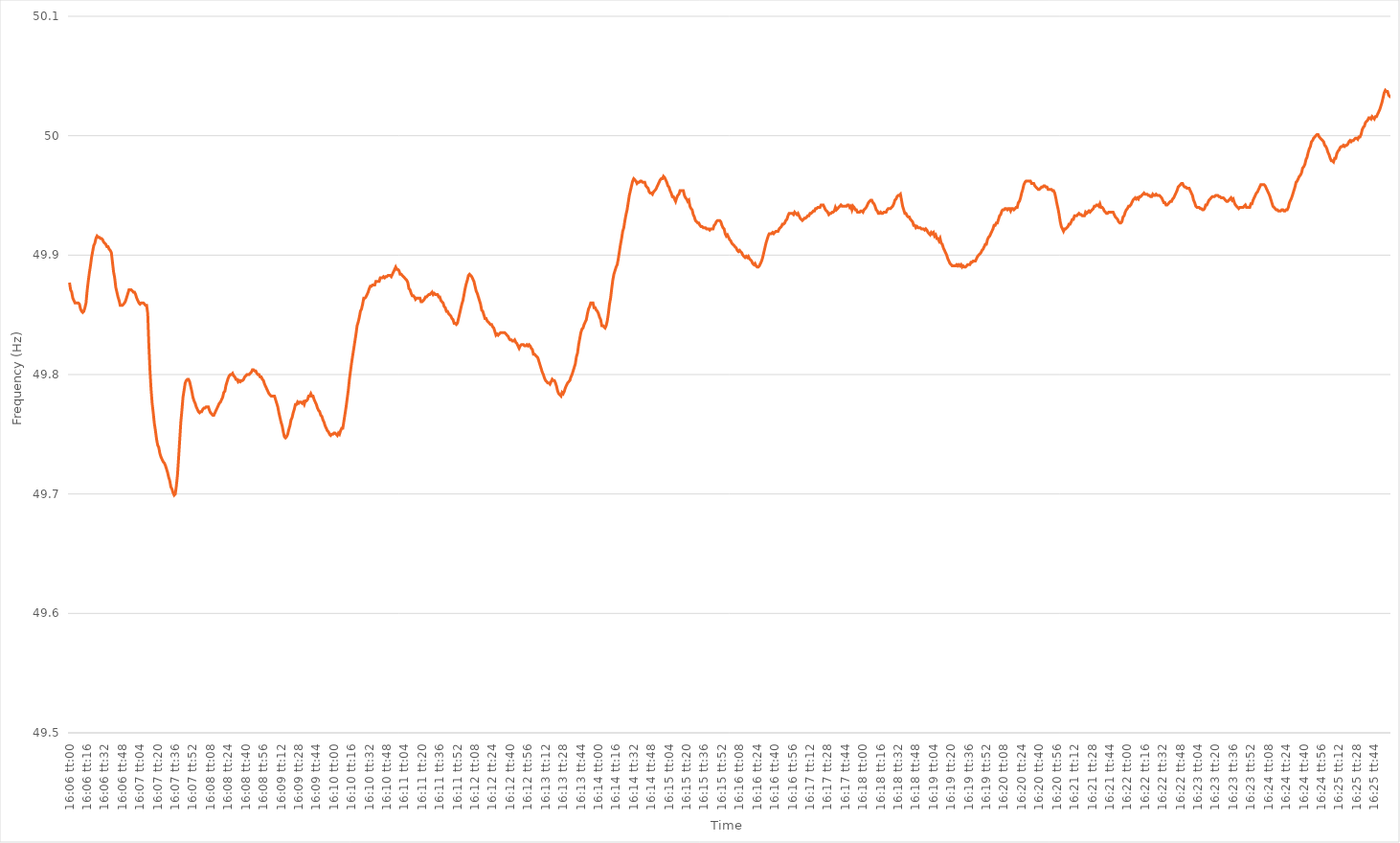
| Category | Series 0 |
|---|---|
| 0.6708333333333334 | 49.877 |
| 0.6708449074074073 | 49.871 |
| 0.6708564814814815 | 49.869 |
| 0.6708680555555556 | 49.864 |
| 0.6708796296296297 | 49.862 |
| 0.6708912037037037 | 49.86 |
| 0.6709027777777777 | 49.86 |
| 0.6709143518518519 | 49.86 |
| 0.670925925925926 | 49.86 |
| 0.6709375 | 49.859 |
| 0.6709490740740741 | 49.855 |
| 0.6709606481481482 | 49.853 |
| 0.6709722222222222 | 49.852 |
| 0.6709837962962962 | 49.853 |
| 0.6709953703703704 | 49.856 |
| 0.6710069444444445 | 49.86 |
| 0.6710185185185185 | 49.87 |
| 0.6710300925925926 | 49.878 |
| 0.6710416666666666 | 49.885 |
| 0.6710532407407408 | 49.891 |
| 0.6710648148148147 | 49.898 |
| 0.6710763888888889 | 49.903 |
| 0.671087962962963 | 49.908 |
| 0.6710995370370371 | 49.91 |
| 0.6711111111111111 | 49.914 |
| 0.6711226851851851 | 49.916 |
| 0.6711342592592593 | 49.915 |
| 0.6711458333333334 | 49.915 |
| 0.6711574074074074 | 49.914 |
| 0.6711689814814815 | 49.914 |
| 0.6711805555555556 | 49.913 |
| 0.6711921296296296 | 49.911 |
| 0.6712037037037036 | 49.91 |
| 0.6712152777777778 | 49.909 |
| 0.6712268518518519 | 49.907 |
| 0.6712384259259259 | 49.907 |
| 0.67125 | 49.905 |
| 0.671261574074074 | 49.904 |
| 0.6712731481481482 | 49.902 |
| 0.6712847222222221 | 49.894 |
| 0.6712962962962963 | 49.886 |
| 0.6713078703703704 | 49.881 |
| 0.6713194444444445 | 49.873 |
| 0.6713310185185185 | 49.869 |
| 0.6713425925925925 | 49.865 |
| 0.6713541666666667 | 49.862 |
| 0.6713657407407408 | 49.858 |
| 0.6713773148148148 | 49.858 |
| 0.6713888888888889 | 49.858 |
| 0.671400462962963 | 49.859 |
| 0.671412037037037 | 49.86 |
| 0.671423611111111 | 49.862 |
| 0.6714351851851852 | 49.865 |
| 0.6714467592592593 | 49.868 |
| 0.6714583333333333 | 49.871 |
| 0.6714699074074074 | 49.871 |
| 0.6714814814814815 | 49.871 |
| 0.6714930555555556 | 49.87 |
| 0.6715046296296295 | 49.869 |
| 0.6715162037037037 | 49.869 |
| 0.6715277777777778 | 49.867 |
| 0.6715393518518519 | 49.864 |
| 0.6715509259259259 | 49.862 |
| 0.6715625 | 49.86 |
| 0.6715740740740741 | 49.859 |
| 0.6715856481481483 | 49.86 |
| 0.6715972222222222 | 49.86 |
| 0.6716087962962963 | 49.86 |
| 0.6716203703703704 | 49.859 |
| 0.6716319444444445 | 49.858 |
| 0.6716435185185184 | 49.858 |
| 0.6716550925925926 | 49.851 |
| 0.6716666666666667 | 49.825 |
| 0.6716782407407407 | 49.804 |
| 0.6716898148148148 | 49.788 |
| 0.6717013888888889 | 49.776 |
| 0.671712962962963 | 49.768 |
| 0.6717245370370369 | 49.759 |
| 0.6717361111111111 | 49.753 |
| 0.6717476851851852 | 49.746 |
| 0.6717592592592593 | 49.741 |
| 0.6717708333333333 | 49.739 |
| 0.6717824074074074 | 49.734 |
| 0.6717939814814815 | 49.731 |
| 0.6718055555555557 | 49.729 |
| 0.6718171296296296 | 49.727 |
| 0.6718287037037037 | 49.726 |
| 0.6718402777777778 | 49.724 |
| 0.6718518518518519 | 49.721 |
| 0.6718634259259259 | 49.718 |
| 0.671875 | 49.714 |
| 0.6718865740740741 | 49.711 |
| 0.6718981481481481 | 49.706 |
| 0.6719097222222222 | 49.704 |
| 0.6719212962962963 | 49.701 |
| 0.6719328703703704 | 49.699 |
| 0.6719444444444443 | 49.7 |
| 0.6719560185185185 | 49.707 |
| 0.6719675925925926 | 49.716 |
| 0.6719791666666667 | 49.73 |
| 0.6719907407407407 | 49.745 |
| 0.6720023148148148 | 49.76 |
| 0.6720138888888889 | 49.77 |
| 0.6720254629629631 | 49.781 |
| 0.672037037037037 | 49.787 |
| 0.6720486111111111 | 49.793 |
| 0.6720601851851852 | 49.795 |
| 0.6720717592592593 | 49.796 |
| 0.6720833333333333 | 49.796 |
| 0.6720949074074074 | 49.794 |
| 0.6721064814814816 | 49.79 |
| 0.6721180555555555 | 49.786 |
| 0.6721296296296296 | 49.781 |
| 0.6721412037037037 | 49.778 |
| 0.6721527777777778 | 49.776 |
| 0.6721643518518517 | 49.773 |
| 0.6721759259259259 | 49.771 |
| 0.6721875 | 49.769 |
| 0.6721990740740741 | 49.768 |
| 0.6722106481481481 | 49.769 |
| 0.6722222222222222 | 49.769 |
| 0.6722337962962963 | 49.771 |
| 0.6722453703703705 | 49.772 |
| 0.6722569444444444 | 49.772 |
| 0.6722685185185185 | 49.773 |
| 0.6722800925925926 | 49.773 |
| 0.6722916666666667 | 49.773 |
| 0.6723032407407407 | 49.77 |
| 0.6723148148148148 | 49.768 |
| 0.672326388888889 | 49.767 |
| 0.672337962962963 | 49.766 |
| 0.672349537037037 | 49.766 |
| 0.6723611111111111 | 49.768 |
| 0.6723726851851852 | 49.77 |
| 0.6723842592592592 | 49.772 |
| 0.6723958333333333 | 49.774 |
| 0.6724074074074075 | 49.776 |
| 0.6724189814814815 | 49.777 |
| 0.6724305555555555 | 49.779 |
| 0.6724421296296296 | 49.781 |
| 0.6724537037037037 | 49.785 |
| 0.6724652777777779 | 49.786 |
| 0.6724768518518518 | 49.791 |
| 0.672488425925926 | 49.794 |
| 0.6725 | 49.797 |
| 0.6725115740740741 | 49.799 |
| 0.6725231481481481 | 49.8 |
| 0.6725347222222222 | 49.8 |
| 0.6725462962962964 | 49.801 |
| 0.6725578703703704 | 49.799 |
| 0.6725694444444444 | 49.798 |
| 0.6725810185185185 | 49.796 |
| 0.6725925925925926 | 49.796 |
| 0.6726041666666666 | 49.794 |
| 0.6726157407407407 | 49.795 |
| 0.6726273148148149 | 49.794 |
| 0.6726388888888889 | 49.795 |
| 0.6726504629629629 | 49.795 |
| 0.672662037037037 | 49.796 |
| 0.6726736111111111 | 49.798 |
| 0.6726851851851853 | 49.799 |
| 0.6726967592592592 | 49.8 |
| 0.6727083333333334 | 49.8 |
| 0.6727199074074074 | 49.8 |
| 0.6727314814814815 | 49.801 |
| 0.6727430555555555 | 49.802 |
| 0.6727546296296296 | 49.804 |
| 0.6727662037037038 | 49.804 |
| 0.6727777777777778 | 49.803 |
| 0.6727893518518518 | 49.803 |
| 0.6728009259259259 | 49.801 |
| 0.6728125 | 49.8 |
| 0.672824074074074 | 49.8 |
| 0.6728356481481481 | 49.798 |
| 0.6728472222222223 | 49.798 |
| 0.6728587962962963 | 49.796 |
| 0.6728703703703703 | 49.795 |
| 0.6728819444444444 | 49.792 |
| 0.6728935185185185 | 49.79 |
| 0.6729050925925927 | 49.788 |
| 0.6729166666666666 | 49.786 |
| 0.6729282407407408 | 49.784 |
| 0.6729398148148148 | 49.783 |
| 0.672951388888889 | 49.782 |
| 0.6729629629629629 | 49.782 |
| 0.672974537037037 | 49.782 |
| 0.6729861111111112 | 49.782 |
| 0.6729976851851852 | 49.779 |
| 0.6730092592592593 | 49.776 |
| 0.6730208333333333 | 49.773 |
| 0.6730324074074074 | 49.768 |
| 0.6730439814814816 | 49.764 |
| 0.6730555555555555 | 49.76 |
| 0.6730671296296297 | 49.757 |
| 0.6730787037037037 | 49.752 |
| 0.6730902777777777 | 49.748 |
| 0.6731018518518518 | 49.747 |
| 0.6731134259259259 | 49.748 |
| 0.6731250000000001 | 49.75 |
| 0.673136574074074 | 49.754 |
| 0.6731481481481482 | 49.757 |
| 0.6731597222222222 | 49.762 |
| 0.6731712962962964 | 49.764 |
| 0.6731828703703703 | 49.768 |
| 0.6731944444444444 | 49.771 |
| 0.6732060185185186 | 49.775 |
| 0.6732175925925926 | 49.775 |
| 0.6732291666666667 | 49.777 |
| 0.6732407407407407 | 49.776 |
| 0.6732523148148148 | 49.777 |
| 0.673263888888889 | 49.777 |
| 0.6732754629629629 | 49.776 |
| 0.6732870370370371 | 49.777 |
| 0.6732986111111111 | 49.775 |
| 0.6733101851851852 | 49.778 |
| 0.6733217592592592 | 49.778 |
| 0.6733333333333333 | 49.779 |
| 0.6733449074074075 | 49.782 |
| 0.6733564814814814 | 49.782 |
| 0.6733680555555556 | 49.784 |
| 0.6733796296296296 | 49.782 |
| 0.6733912037037038 | 49.782 |
| 0.6734027777777777 | 49.779 |
| 0.6734143518518518 | 49.777 |
| 0.673425925925926 | 49.775 |
| 0.6734375 | 49.772 |
| 0.6734490740740741 | 49.77 |
| 0.6734606481481481 | 49.769 |
| 0.6734722222222222 | 49.766 |
| 0.6734837962962964 | 49.765 |
| 0.6734953703703703 | 49.762 |
| 0.6735069444444445 | 49.76 |
| 0.6735185185185185 | 49.757 |
| 0.6735300925925927 | 49.755 |
| 0.6735416666666666 | 49.753 |
| 0.6735532407407407 | 49.752 |
| 0.6735648148148149 | 49.75 |
| 0.6735763888888888 | 49.749 |
| 0.673587962962963 | 49.75 |
| 0.673599537037037 | 49.75 |
| 0.6736111111111112 | 49.751 |
| 0.6736226851851851 | 49.751 |
| 0.6736342592592592 | 49.75 |
| 0.6736458333333334 | 49.749 |
| 0.6736574074074074 | 49.751 |
| 0.6736689814814815 | 49.75 |
| 0.6736805555555555 | 49.753 |
| 0.6736921296296297 | 49.755 |
| 0.6737037037037038 | 49.755 |
| 0.6737152777777777 | 49.761 |
| 0.6737268518518519 | 49.767 |
| 0.6737384259259259 | 49.773 |
| 0.6737500000000001 | 49.78 |
| 0.673761574074074 | 49.787 |
| 0.6737731481481481 | 49.796 |
| 0.6737847222222223 | 49.803 |
| 0.6737962962962962 | 49.81 |
| 0.6738078703703704 | 49.816 |
| 0.6738194444444444 | 49.822 |
| 0.6738310185185186 | 49.828 |
| 0.6738425925925925 | 49.834 |
| 0.6738541666666666 | 49.841 |
| 0.6738657407407408 | 49.844 |
| 0.6738773148148148 | 49.848 |
| 0.6738888888888889 | 49.853 |
| 0.6739004629629629 | 49.855 |
| 0.6739120370370371 | 49.859 |
| 0.6739236111111112 | 49.864 |
| 0.6739351851851851 | 49.864 |
| 0.6739467592592593 | 49.865 |
| 0.6739583333333333 | 49.867 |
| 0.6739699074074075 | 49.869 |
| 0.6739814814814814 | 49.872 |
| 0.6739930555555556 | 49.874 |
| 0.6740046296296297 | 49.874 |
| 0.6740162037037036 | 49.875 |
| 0.6740277777777778 | 49.875 |
| 0.6740393518518518 | 49.875 |
| 0.674050925925926 | 49.878 |
| 0.6740624999999999 | 49.878 |
| 0.674074074074074 | 49.878 |
| 0.6740856481481482 | 49.878 |
| 0.6740972222222222 | 49.881 |
| 0.6741087962962963 | 49.881 |
| 0.6741203703703703 | 49.881 |
| 0.6741319444444445 | 49.882 |
| 0.6741435185185186 | 49.881 |
| 0.6741550925925925 | 49.882 |
| 0.6741666666666667 | 49.882 |
| 0.6741782407407407 | 49.883 |
| 0.6741898148148149 | 49.883 |
| 0.6742013888888888 | 49.883 |
| 0.674212962962963 | 49.882 |
| 0.6742245370370371 | 49.884 |
| 0.6742361111111111 | 49.886 |
| 0.6742476851851852 | 49.888 |
| 0.6742592592592592 | 49.89 |
| 0.6742708333333334 | 49.888 |
| 0.6742824074074073 | 49.888 |
| 0.6742939814814815 | 49.887 |
| 0.6743055555555556 | 49.884 |
| 0.6743171296296296 | 49.884 |
| 0.6743287037037037 | 49.883 |
| 0.6743402777777777 | 49.882 |
| 0.6743518518518519 | 49.881 |
| 0.674363425925926 | 49.88 |
| 0.674375 | 49.879 |
| 0.6743865740740741 | 49.877 |
| 0.6743981481481481 | 49.872 |
| 0.6744097222222223 | 49.871 |
| 0.6744212962962962 | 49.868 |
| 0.6744328703703704 | 49.866 |
| 0.6744444444444445 | 49.866 |
| 0.6744560185185186 | 49.865 |
| 0.6744675925925926 | 49.863 |
| 0.6744791666666666 | 49.864 |
| 0.6744907407407408 | 49.864 |
| 0.6745023148148147 | 49.864 |
| 0.6745138888888889 | 49.864 |
| 0.674525462962963 | 49.861 |
| 0.674537037037037 | 49.861 |
| 0.6745486111111111 | 49.862 |
| 0.6745601851851851 | 49.863 |
| 0.6745717592592593 | 49.865 |
| 0.6745833333333334 | 49.865 |
| 0.6745949074074074 | 49.866 |
| 0.6746064814814815 | 49.867 |
| 0.6746180555555555 | 49.867 |
| 0.6746296296296297 | 49.868 |
| 0.6746412037037036 | 49.869 |
| 0.6746527777777778 | 49.867 |
| 0.6746643518518519 | 49.868 |
| 0.674675925925926 | 49.867 |
| 0.6746875 | 49.867 |
| 0.674699074074074 | 49.867 |
| 0.6747106481481482 | 49.865 |
| 0.6747222222222221 | 49.865 |
| 0.6747337962962963 | 49.862 |
| 0.6747453703703704 | 49.861 |
| 0.6747569444444445 | 49.86 |
| 0.6747685185185185 | 49.857 |
| 0.6747800925925925 | 49.856 |
| 0.6747916666666667 | 49.853 |
| 0.6748032407407408 | 49.853 |
| 0.6748148148148148 | 49.851 |
| 0.6748263888888889 | 49.85 |
| 0.674837962962963 | 49.849 |
| 0.6748495370370371 | 49.847 |
| 0.674861111111111 | 49.846 |
| 0.6748726851851852 | 49.843 |
| 0.6748842592592593 | 49.843 |
| 0.6748958333333334 | 49.842 |
| 0.6749074074074074 | 49.843 |
| 0.6749189814814814 | 49.847 |
| 0.6749305555555556 | 49.851 |
| 0.6749421296296297 | 49.855 |
| 0.6749537037037037 | 49.859 |
| 0.6749652777777778 | 49.862 |
| 0.6749768518518519 | 49.867 |
| 0.6749884259259259 | 49.872 |
| 0.6749999999999999 | 49.876 |
| 0.6750115740740741 | 49.879 |
| 0.6750231481481482 | 49.883 |
| 0.6750347222222222 | 49.884 |
| 0.6750462962962963 | 49.883 |
| 0.6750578703703703 | 49.882 |
| 0.6750694444444445 | 49.88 |
| 0.6750810185185184 | 49.878 |
| 0.6750925925925926 | 49.874 |
| 0.6751041666666667 | 49.87 |
| 0.6751157407407408 | 49.868 |
| 0.6751273148148148 | 49.865 |
| 0.6751388888888888 | 49.862 |
| 0.675150462962963 | 49.859 |
| 0.6751620370370371 | 49.854 |
| 0.6751736111111111 | 49.853 |
| 0.6751851851851852 | 49.85 |
| 0.6751967592592593 | 49.847 |
| 0.6752083333333333 | 49.847 |
| 0.6752199074074073 | 49.845 |
| 0.6752314814814815 | 49.844 |
| 0.6752430555555556 | 49.843 |
| 0.6752546296296296 | 49.842 |
| 0.6752662037037037 | 49.842 |
| 0.6752777777777778 | 49.84 |
| 0.6752893518518519 | 49.839 |
| 0.6753009259259258 | 49.836 |
| 0.6753125 | 49.833 |
| 0.6753240740740741 | 49.834 |
| 0.6753356481481482 | 49.833 |
| 0.6753472222222222 | 49.834 |
| 0.6753587962962962 | 49.835 |
| 0.6753703703703704 | 49.835 |
| 0.6753819444444445 | 49.835 |
| 0.6753935185185185 | 49.835 |
| 0.6754050925925926 | 49.835 |
| 0.6754166666666667 | 49.834 |
| 0.6754282407407407 | 49.833 |
| 0.6754398148148147 | 49.832 |
| 0.6754513888888889 | 49.83 |
| 0.675462962962963 | 49.829 |
| 0.675474537037037 | 49.829 |
| 0.6754861111111111 | 49.828 |
| 0.6754976851851852 | 49.828 |
| 0.6755092592592593 | 49.829 |
| 0.6755208333333332 | 49.827 |
| 0.6755324074074074 | 49.826 |
| 0.6755439814814815 | 49.824 |
| 0.6755555555555556 | 49.822 |
| 0.6755671296296296 | 49.824 |
| 0.6755787037037037 | 49.825 |
| 0.6755902777777778 | 49.825 |
| 0.675601851851852 | 49.825 |
| 0.6756134259259259 | 49.824 |
| 0.675625 | 49.824 |
| 0.6756365740740741 | 49.825 |
| 0.6756481481481482 | 49.824 |
| 0.6756597222222221 | 49.825 |
| 0.6756712962962963 | 49.824 |
| 0.6756828703703704 | 49.822 |
| 0.6756944444444444 | 49.821 |
| 0.6757060185185185 | 49.817 |
| 0.6757175925925926 | 49.817 |
| 0.6757291666666667 | 49.816 |
| 0.6757407407407406 | 49.815 |
| 0.6757523148148148 | 49.814 |
| 0.6757638888888889 | 49.811 |
| 0.675775462962963 | 49.808 |
| 0.675787037037037 | 49.805 |
| 0.6757986111111111 | 49.802 |
| 0.6758101851851852 | 49.8 |
| 0.6758217592592594 | 49.797 |
| 0.6758333333333333 | 49.795 |
| 0.6758449074074074 | 49.794 |
| 0.6758564814814815 | 49.793 |
| 0.6758680555555556 | 49.793 |
| 0.6758796296296296 | 49.792 |
| 0.6758912037037037 | 49.794 |
| 0.6759027777777779 | 49.796 |
| 0.6759143518518518 | 49.795 |
| 0.6759259259259259 | 49.795 |
| 0.6759375 | 49.793 |
| 0.6759490740740741 | 49.79 |
| 0.675960648148148 | 49.786 |
| 0.6759722222222222 | 49.784 |
| 0.6759837962962963 | 49.783 |
| 0.6759953703703704 | 49.782 |
| 0.6760069444444444 | 49.785 |
| 0.6760185185185185 | 49.784 |
| 0.6760300925925926 | 49.786 |
| 0.6760416666666668 | 49.789 |
| 0.6760532407407407 | 49.791 |
| 0.6760648148148148 | 49.793 |
| 0.6760763888888889 | 49.794 |
| 0.676087962962963 | 49.795 |
| 0.676099537037037 | 49.798 |
| 0.6761111111111111 | 49.8 |
| 0.6761226851851853 | 49.803 |
| 0.6761342592592593 | 49.806 |
| 0.6761458333333333 | 49.809 |
| 0.6761574074074074 | 49.815 |
| 0.6761689814814815 | 49.818 |
| 0.6761805555555555 | 49.825 |
| 0.6761921296296296 | 49.83 |
| 0.6762037037037038 | 49.835 |
| 0.6762152777777778 | 49.838 |
| 0.6762268518518518 | 49.839 |
| 0.6762384259259259 | 49.842 |
| 0.67625 | 49.844 |
| 0.6762615740740742 | 49.846 |
| 0.6762731481481481 | 49.851 |
| 0.6762847222222222 | 49.855 |
| 0.6762962962962963 | 49.857 |
| 0.6763078703703704 | 49.86 |
| 0.6763194444444444 | 49.86 |
| 0.6763310185185185 | 49.86 |
| 0.6763425925925927 | 49.856 |
| 0.6763541666666667 | 49.856 |
| 0.6763657407407407 | 49.854 |
| 0.6763773148148148 | 49.853 |
| 0.6763888888888889 | 49.851 |
| 0.6764004629629629 | 49.848 |
| 0.676412037037037 | 49.846 |
| 0.6764236111111112 | 49.841 |
| 0.6764351851851852 | 49.841 |
| 0.6764467592592592 | 49.84 |
| 0.6764583333333333 | 49.839 |
| 0.6764699074074074 | 49.841 |
| 0.6764814814814816 | 49.845 |
| 0.6764930555555555 | 49.851 |
| 0.6765046296296297 | 49.859 |
| 0.6765162037037037 | 49.864 |
| 0.6765277777777778 | 49.872 |
| 0.6765393518518518 | 49.879 |
| 0.6765509259259259 | 49.884 |
| 0.6765625000000001 | 49.887 |
| 0.6765740740740741 | 49.89 |
| 0.6765856481481481 | 49.892 |
| 0.6765972222222222 | 49.897 |
| 0.6766087962962963 | 49.903 |
| 0.6766203703703703 | 49.909 |
| 0.6766319444444444 | 49.914 |
| 0.6766435185185186 | 49.92 |
| 0.6766550925925926 | 49.923 |
| 0.6766666666666666 | 49.929 |
| 0.6766782407407407 | 49.934 |
| 0.6766898148148148 | 49.938 |
| 0.676701388888889 | 49.944 |
| 0.6767129629629629 | 49.95 |
| 0.676724537037037 | 49.954 |
| 0.6767361111111111 | 49.958 |
| 0.6767476851851852 | 49.962 |
| 0.6767592592592592 | 49.964 |
| 0.6767708333333333 | 49.963 |
| 0.6767824074074075 | 49.962 |
| 0.6767939814814815 | 49.96 |
| 0.6768055555555555 | 49.961 |
| 0.6768171296296296 | 49.961 |
| 0.6768287037037037 | 49.962 |
| 0.6768402777777779 | 49.962 |
| 0.6768518518518518 | 49.961 |
| 0.676863425925926 | 49.961 |
| 0.676875 | 49.961 |
| 0.676886574074074 | 49.958 |
| 0.6768981481481481 | 49.957 |
| 0.6769097222222222 | 49.956 |
| 0.6769212962962964 | 49.953 |
| 0.6769328703703703 | 49.952 |
| 0.6769444444444445 | 49.952 |
| 0.6769560185185185 | 49.951 |
| 0.6769675925925926 | 49.953 |
| 0.6769791666666666 | 49.954 |
| 0.6769907407407407 | 49.955 |
| 0.6770023148148149 | 49.957 |
| 0.6770138888888889 | 49.959 |
| 0.677025462962963 | 49.961 |
| 0.677037037037037 | 49.963 |
| 0.6770486111111111 | 49.964 |
| 0.6770601851851853 | 49.964 |
| 0.6770717592592592 | 49.966 |
| 0.6770833333333334 | 49.965 |
| 0.6770949074074074 | 49.963 |
| 0.6771064814814814 | 49.961 |
| 0.6771180555555555 | 49.958 |
| 0.6771296296296296 | 49.957 |
| 0.6771412037037038 | 49.954 |
| 0.6771527777777777 | 49.952 |
| 0.6771643518518519 | 49.949 |
| 0.6771759259259259 | 49.949 |
| 0.6771875 | 49.947 |
| 0.677199074074074 | 49.945 |
| 0.6772106481481481 | 49.948 |
| 0.6772222222222223 | 49.95 |
| 0.6772337962962963 | 49.951 |
| 0.6772453703703704 | 49.954 |
| 0.6772569444444444 | 49.954 |
| 0.6772685185185185 | 49.954 |
| 0.6772800925925927 | 49.954 |
| 0.6772916666666666 | 49.95 |
| 0.6773032407407408 | 49.948 |
| 0.6773148148148148 | 49.947 |
| 0.6773263888888889 | 49.945 |
| 0.6773379629629629 | 49.946 |
| 0.677349537037037 | 49.941 |
| 0.6773611111111112 | 49.939 |
| 0.6773726851851851 | 49.938 |
| 0.6773842592592593 | 49.934 |
| 0.6773958333333333 | 49.932 |
| 0.6774074074074075 | 49.929 |
| 0.6774189814814814 | 49.928 |
| 0.6774305555555555 | 49.927 |
| 0.6774421296296297 | 49.927 |
| 0.6774537037037037 | 49.925 |
| 0.6774652777777778 | 49.924 |
| 0.6774768518518518 | 49.924 |
| 0.677488425925926 | 49.923 |
| 0.6775000000000001 | 49.923 |
| 0.677511574074074 | 49.923 |
| 0.6775231481481482 | 49.922 |
| 0.6775347222222222 | 49.922 |
| 0.6775462962962964 | 49.922 |
| 0.6775578703703703 | 49.921 |
| 0.6775694444444444 | 49.922 |
| 0.6775810185185186 | 49.922 |
| 0.6775925925925925 | 49.922 |
| 0.6776041666666667 | 49.925 |
| 0.6776157407407407 | 49.926 |
| 0.6776273148148149 | 49.928 |
| 0.6776388888888888 | 49.929 |
| 0.6776504629629629 | 49.929 |
| 0.6776620370370371 | 49.929 |
| 0.6776736111111111 | 49.928 |
| 0.6776851851851852 | 49.925 |
| 0.6776967592592592 | 49.923 |
| 0.6777083333333334 | 49.922 |
| 0.6777199074074075 | 49.918 |
| 0.6777314814814814 | 49.916 |
| 0.6777430555555556 | 49.917 |
| 0.6777546296296296 | 49.915 |
| 0.6777662037037038 | 49.913 |
| 0.6777777777777777 | 49.912 |
| 0.6777893518518519 | 49.91 |
| 0.677800925925926 | 49.909 |
| 0.6778124999999999 | 49.908 |
| 0.6778240740740741 | 49.907 |
| 0.6778356481481481 | 49.906 |
| 0.6778472222222223 | 49.904 |
| 0.6778587962962962 | 49.903 |
| 0.6778703703703703 | 49.904 |
| 0.6778819444444445 | 49.903 |
| 0.6778935185185185 | 49.902 |
| 0.6779050925925926 | 49.9 |
| 0.6779166666666666 | 49.899 |
| 0.6779282407407408 | 49.898 |
| 0.6779398148148149 | 49.899 |
| 0.6779513888888888 | 49.898 |
| 0.677962962962963 | 49.899 |
| 0.677974537037037 | 49.897 |
| 0.6779861111111112 | 49.896 |
| 0.6779976851851851 | 49.895 |
| 0.6780092592592593 | 49.893 |
| 0.6780208333333334 | 49.892 |
| 0.6780324074074073 | 49.893 |
| 0.6780439814814815 | 49.891 |
| 0.6780555555555555 | 49.89 |
| 0.6780671296296297 | 49.89 |
| 0.6780787037037036 | 49.891 |
| 0.6780902777777778 | 49.893 |
| 0.6781018518518519 | 49.895 |
| 0.6781134259259259 | 49.898 |
| 0.678125 | 49.902 |
| 0.678136574074074 | 49.906 |
| 0.6781481481481482 | 49.91 |
| 0.6781597222222223 | 49.913 |
| 0.6781712962962962 | 49.916 |
| 0.6781828703703704 | 49.918 |
| 0.6781944444444444 | 49.918 |
| 0.6782060185185186 | 49.918 |
| 0.6782175925925925 | 49.919 |
| 0.6782291666666667 | 49.918 |
| 0.6782407407407408 | 49.919 |
| 0.6782523148148148 | 49.92 |
| 0.6782638888888889 | 49.92 |
| 0.6782754629629629 | 49.92 |
| 0.6782870370370371 | 49.922 |
| 0.678298611111111 | 49.923 |
| 0.6783101851851852 | 49.924 |
| 0.6783217592592593 | 49.926 |
| 0.6783333333333333 | 49.926 |
| 0.6783449074074074 | 49.927 |
| 0.6783564814814814 | 49.929 |
| 0.6783680555555556 | 49.93 |
| 0.6783796296296297 | 49.933 |
| 0.6783912037037036 | 49.935 |
| 0.6784027777777778 | 49.935 |
| 0.6784143518518518 | 49.935 |
| 0.678425925925926 | 49.935 |
| 0.6784374999999999 | 49.934 |
| 0.6784490740740741 | 49.936 |
| 0.6784606481481482 | 49.935 |
| 0.6784722222222223 | 49.934 |
| 0.6784837962962963 | 49.935 |
| 0.6784953703703703 | 49.933 |
| 0.6785069444444445 | 49.931 |
| 0.6785185185185184 | 49.93 |
| 0.6785300925925926 | 49.929 |
| 0.6785416666666667 | 49.93 |
| 0.6785532407407407 | 49.931 |
| 0.6785648148148148 | 49.931 |
| 0.6785763888888888 | 49.932 |
| 0.678587962962963 | 49.933 |
| 0.6785995370370371 | 49.933 |
| 0.678611111111111 | 49.935 |
| 0.6786226851851852 | 49.935 |
| 0.6786342592592592 | 49.936 |
| 0.6786458333333334 | 49.937 |
| 0.6786574074074073 | 49.937 |
| 0.6786689814814815 | 49.939 |
| 0.6786805555555556 | 49.939 |
| 0.6786921296296297 | 49.94 |
| 0.6787037037037037 | 49.94 |
| 0.6787152777777777 | 49.94 |
| 0.6787268518518519 | 49.942 |
| 0.678738425925926 | 49.942 |
| 0.67875 | 49.942 |
| 0.6787615740740741 | 49.94 |
| 0.6787731481481482 | 49.938 |
| 0.6787847222222222 | 49.937 |
| 0.6787962962962962 | 49.936 |
| 0.6788078703703704 | 49.934 |
| 0.6788194444444445 | 49.935 |
| 0.6788310185185185 | 49.935 |
| 0.6788425925925926 | 49.936 |
| 0.6788541666666666 | 49.936 |
| 0.6788657407407408 | 49.937 |
| 0.6788773148148147 | 49.94 |
| 0.6788888888888889 | 49.938 |
| 0.678900462962963 | 49.939 |
| 0.6789120370370371 | 49.94 |
| 0.6789236111111111 | 49.941 |
| 0.6789351851851851 | 49.942 |
| 0.6789467592592593 | 49.941 |
| 0.6789583333333334 | 49.941 |
| 0.6789699074074074 | 49.941 |
| 0.6789814814814815 | 49.941 |
| 0.6789930555555556 | 49.941 |
| 0.6790046296296296 | 49.942 |
| 0.6790162037037036 | 49.942 |
| 0.6790277777777778 | 49.94 |
| 0.6790393518518519 | 49.941 |
| 0.6790509259259259 | 49.938 |
| 0.6790625 | 49.941 |
| 0.679074074074074 | 49.94 |
| 0.6790856481481482 | 49.938 |
| 0.6790972222222221 | 49.938 |
| 0.6791087962962963 | 49.936 |
| 0.6791203703703704 | 49.936 |
| 0.6791319444444445 | 49.936 |
| 0.6791435185185185 | 49.937 |
| 0.6791550925925925 | 49.937 |
| 0.6791666666666667 | 49.936 |
| 0.6791782407407408 | 49.938 |
| 0.6791898148148148 | 49.939 |
| 0.6792013888888889 | 49.94 |
| 0.679212962962963 | 49.942 |
| 0.679224537037037 | 49.944 |
| 0.679236111111111 | 49.945 |
| 0.6792476851851852 | 49.946 |
| 0.6792592592592593 | 49.946 |
| 0.6792708333333333 | 49.944 |
| 0.6792824074074074 | 49.943 |
| 0.6792939814814815 | 49.941 |
| 0.6793055555555556 | 49.938 |
| 0.6793171296296295 | 49.937 |
| 0.6793287037037037 | 49.935 |
| 0.6793402777777778 | 49.935 |
| 0.6793518518518519 | 49.936 |
| 0.6793634259259259 | 49.935 |
| 0.679375 | 49.935 |
| 0.6793865740740741 | 49.936 |
| 0.6793981481481483 | 49.936 |
| 0.6794097222222222 | 49.936 |
| 0.6794212962962963 | 49.938 |
| 0.6794328703703704 | 49.939 |
| 0.6794444444444444 | 49.939 |
| 0.6794560185185184 | 49.939 |
| 0.6794675925925926 | 49.94 |
| 0.6794791666666667 | 49.941 |
| 0.6794907407407407 | 49.943 |
| 0.6795023148148148 | 49.946 |
| 0.6795138888888889 | 49.947 |
| 0.679525462962963 | 49.949 |
| 0.6795370370370369 | 49.95 |
| 0.6795486111111111 | 49.95 |
| 0.6795601851851852 | 49.951 |
| 0.6795717592592593 | 49.946 |
| 0.6795833333333333 | 49.941 |
| 0.6795949074074074 | 49.938 |
| 0.6796064814814815 | 49.935 |
| 0.6796180555555557 | 49.935 |
| 0.6796296296296296 | 49.933 |
| 0.6796412037037037 | 49.932 |
| 0.6796527777777778 | 49.932 |
| 0.6796643518518519 | 49.93 |
| 0.6796759259259259 | 49.929 |
| 0.6796875 | 49.928 |
| 0.6796990740740741 | 49.925 |
| 0.6797106481481481 | 49.925 |
| 0.6797222222222222 | 49.923 |
| 0.6797337962962963 | 49.924 |
| 0.6797453703703704 | 49.923 |
| 0.6797569444444443 | 49.923 |
| 0.6797685185185185 | 49.923 |
| 0.6797800925925926 | 49.922 |
| 0.6797916666666667 | 49.922 |
| 0.6798032407407407 | 49.922 |
| 0.6798148148148148 | 49.921 |
| 0.6798263888888889 | 49.922 |
| 0.6798379629629631 | 49.921 |
| 0.679849537037037 | 49.919 |
| 0.6798611111111111 | 49.918 |
| 0.6798726851851852 | 49.917 |
| 0.6798842592592593 | 49.919 |
| 0.6798958333333333 | 49.918 |
| 0.6799074074074074 | 49.919 |
| 0.6799189814814816 | 49.916 |
| 0.6799305555555556 | 49.917 |
| 0.6799421296296296 | 49.914 |
| 0.6799537037037037 | 49.914 |
| 0.6799652777777778 | 49.912 |
| 0.6799768518518517 | 49.914 |
| 0.6799884259259259 | 49.91 |
| 0.68 | 49.909 |
| 0.6800115740740741 | 49.906 |
| 0.6800231481481481 | 49.904 |
| 0.6800347222222222 | 49.902 |
| 0.6800462962962963 | 49.9 |
| 0.6800578703703705 | 49.897 |
| 0.6800694444444444 | 49.895 |
| 0.6800810185185185 | 49.893 |
| 0.6800925925925926 | 49.892 |
| 0.6801041666666667 | 49.891 |
| 0.6801157407407407 | 49.891 |
| 0.6801273148148148 | 49.891 |
| 0.680138888888889 | 49.891 |
| 0.680150462962963 | 49.892 |
| 0.680162037037037 | 49.891 |
| 0.6801736111111111 | 49.892 |
| 0.6801851851851852 | 49.891 |
| 0.6801967592592592 | 49.892 |
| 0.6802083333333333 | 49.89 |
| 0.6802199074074075 | 49.891 |
| 0.6802314814814815 | 49.89 |
| 0.6802430555555555 | 49.89 |
| 0.6802546296296296 | 49.891 |
| 0.6802662037037037 | 49.892 |
| 0.6802777777777779 | 49.892 |
| 0.6802893518518518 | 49.892 |
| 0.680300925925926 | 49.894 |
| 0.6803125 | 49.894 |
| 0.6803240740740741 | 49.895 |
| 0.6803356481481481 | 49.895 |
| 0.6803472222222222 | 49.895 |
| 0.6803587962962964 | 49.897 |
| 0.6803703703703704 | 49.899 |
| 0.6803819444444444 | 49.9 |
| 0.6803935185185185 | 49.901 |
| 0.6804050925925926 | 49.902 |
| 0.6804166666666666 | 49.904 |
| 0.6804282407407407 | 49.905 |
| 0.6804398148148149 | 49.907 |
| 0.6804513888888889 | 49.909 |
| 0.6804629629629629 | 49.909 |
| 0.680474537037037 | 49.913 |
| 0.6804861111111111 | 49.915 |
| 0.6804976851851853 | 49.916 |
| 0.6805092592592592 | 49.918 |
| 0.6805208333333334 | 49.92 |
| 0.6805324074074074 | 49.922 |
| 0.6805439814814815 | 49.925 |
| 0.6805555555555555 | 49.925 |
| 0.6805671296296296 | 49.927 |
| 0.6805787037037038 | 49.927 |
| 0.6805902777777778 | 49.93 |
| 0.6806018518518518 | 49.933 |
| 0.6806134259259259 | 49.934 |
| 0.680625 | 49.937 |
| 0.680636574074074 | 49.938 |
| 0.6806481481481481 | 49.938 |
| 0.6806597222222223 | 49.939 |
| 0.6806712962962963 | 49.939 |
| 0.6806828703703703 | 49.938 |
| 0.6806944444444444 | 49.939 |
| 0.6807060185185185 | 49.939 |
| 0.6807175925925927 | 49.937 |
| 0.6807291666666666 | 49.939 |
| 0.6807407407407408 | 49.939 |
| 0.6807523148148148 | 49.938 |
| 0.680763888888889 | 49.939 |
| 0.6807754629629629 | 49.94 |
| 0.680787037037037 | 49.94 |
| 0.6807986111111112 | 49.944 |
| 0.6808101851851852 | 49.945 |
| 0.6808217592592593 | 49.948 |
| 0.6808333333333333 | 49.952 |
| 0.6808449074074074 | 49.955 |
| 0.6808564814814816 | 49.959 |
| 0.6808680555555555 | 49.961 |
| 0.6808796296296297 | 49.962 |
| 0.6808912037037037 | 49.962 |
| 0.6809027777777777 | 49.962 |
| 0.6809143518518518 | 49.962 |
| 0.6809259259259259 | 49.962 |
| 0.6809375000000001 | 49.96 |
| 0.680949074074074 | 49.96 |
| 0.6809606481481482 | 49.96 |
| 0.6809722222222222 | 49.958 |
| 0.6809837962962964 | 49.957 |
| 0.6809953703703703 | 49.956 |
| 0.6810069444444444 | 49.955 |
| 0.6810185185185186 | 49.955 |
| 0.6810300925925926 | 49.956 |
| 0.6810416666666667 | 49.957 |
| 0.6810532407407407 | 49.957 |
| 0.6810648148148148 | 49.958 |
| 0.681076388888889 | 49.958 |
| 0.6810879629629629 | 49.957 |
| 0.6810995370370371 | 49.957 |
| 0.6811111111111111 | 49.955 |
| 0.6811226851851852 | 49.955 |
| 0.6811342592592592 | 49.955 |
| 0.6811458333333333 | 49.955 |
| 0.6811574074074075 | 49.954 |
| 0.6811689814814814 | 49.954 |
| 0.6811805555555556 | 49.952 |
| 0.6811921296296296 | 49.948 |
| 0.6812037037037038 | 49.943 |
| 0.6812152777777777 | 49.939 |
| 0.6812268518518518 | 49.934 |
| 0.681238425925926 | 49.928 |
| 0.68125 | 49.924 |
| 0.6812615740740741 | 49.922 |
| 0.6812731481481481 | 49.92 |
| 0.6812847222222222 | 49.922 |
| 0.6812962962962964 | 49.922 |
| 0.6813078703703703 | 49.923 |
| 0.6813194444444445 | 49.924 |
| 0.6813310185185185 | 49.926 |
| 0.6813425925925927 | 49.926 |
| 0.6813541666666666 | 49.928 |
| 0.6813657407407407 | 49.93 |
| 0.6813773148148149 | 49.93 |
| 0.6813888888888888 | 49.933 |
| 0.681400462962963 | 49.933 |
| 0.681412037037037 | 49.933 |
| 0.6814236111111112 | 49.934 |
| 0.6814351851851851 | 49.935 |
| 0.6814467592592592 | 49.934 |
| 0.6814583333333334 | 49.934 |
| 0.6814699074074074 | 49.933 |
| 0.6814814814814815 | 49.933 |
| 0.6814930555555555 | 49.933 |
| 0.6815046296296297 | 49.936 |
| 0.6815162037037038 | 49.935 |
| 0.6815277777777777 | 49.936 |
| 0.6815393518518519 | 49.937 |
| 0.6815509259259259 | 49.936 |
| 0.6815625000000001 | 49.937 |
| 0.681574074074074 | 49.938 |
| 0.6815856481481481 | 49.939 |
| 0.6815972222222223 | 49.941 |
| 0.6816087962962962 | 49.941 |
| 0.6816203703703704 | 49.942 |
| 0.6816319444444444 | 49.942 |
| 0.6816435185185186 | 49.941 |
| 0.6816550925925925 | 49.943 |
| 0.6816666666666666 | 49.94 |
| 0.6816782407407408 | 49.94 |
| 0.6816898148148148 | 49.939 |
| 0.6817013888888889 | 49.937 |
| 0.6817129629629629 | 49.936 |
| 0.6817245370370371 | 49.935 |
| 0.6817361111111112 | 49.935 |
| 0.6817476851851851 | 49.936 |
| 0.6817592592592593 | 49.936 |
| 0.6817708333333333 | 49.936 |
| 0.6817824074074075 | 49.936 |
| 0.6817939814814814 | 49.936 |
| 0.6818055555555556 | 49.934 |
| 0.6818171296296297 | 49.932 |
| 0.6818287037037036 | 49.931 |
| 0.6818402777777778 | 49.93 |
| 0.6818518518518518 | 49.928 |
| 0.681863425925926 | 49.927 |
| 0.6818749999999999 | 49.927 |
| 0.681886574074074 | 49.928 |
| 0.6818981481481482 | 49.932 |
| 0.6819097222222222 | 49.933 |
| 0.6819212962962963 | 49.936 |
| 0.6819328703703703 | 49.938 |
| 0.6819444444444445 | 49.939 |
| 0.6819560185185186 | 49.941 |
| 0.6819675925925925 | 49.941 |
| 0.6819791666666667 | 49.942 |
| 0.6819907407407407 | 49.944 |
| 0.6820023148148149 | 49.946 |
| 0.6820138888888888 | 49.947 |
| 0.682025462962963 | 49.948 |
| 0.6820370370370371 | 49.947 |
| 0.682048611111111 | 49.948 |
| 0.6820601851851852 | 49.947 |
| 0.6820717592592592 | 49.949 |
| 0.6820833333333334 | 49.949 |
| 0.6820949074074073 | 49.95 |
| 0.6821064814814815 | 49.951 |
| 0.6821180555555556 | 49.952 |
| 0.6821296296296296 | 49.951 |
| 0.6821412037037037 | 49.951 |
| 0.6821527777777777 | 49.951 |
| 0.6821643518518519 | 49.95 |
| 0.682175925925926 | 49.95 |
| 0.6821875 | 49.949 |
| 0.6821990740740741 | 49.949 |
| 0.6822106481481481 | 49.951 |
| 0.6822222222222223 | 49.95 |
| 0.6822337962962962 | 49.95 |
| 0.6822453703703704 | 49.951 |
| 0.6822569444444445 | 49.95 |
| 0.6822685185185186 | 49.95 |
| 0.6822800925925926 | 49.95 |
| 0.6822916666666666 | 49.949 |
| 0.6823032407407408 | 49.948 |
| 0.6823148148148147 | 49.946 |
| 0.6823263888888889 | 49.944 |
| 0.682337962962963 | 49.944 |
| 0.682349537037037 | 49.942 |
| 0.6823611111111111 | 49.942 |
| 0.6823726851851851 | 49.943 |
| 0.6823842592592593 | 49.944 |
| 0.6823958333333334 | 49.945 |
| 0.6824074074074074 | 49.945 |
| 0.6824189814814815 | 49.947 |
| 0.6824305555555555 | 49.948 |
| 0.6824421296296297 | 49.95 |
| 0.6824537037037036 | 49.952 |
| 0.6824652777777778 | 49.954 |
| 0.6824768518518519 | 49.957 |
| 0.682488425925926 | 49.958 |
| 0.6825 | 49.959 |
| 0.682511574074074 | 49.96 |
| 0.6825231481481482 | 49.96 |
| 0.6825347222222223 | 49.958 |
| 0.6825462962962963 | 49.957 |
| 0.6825578703703704 | 49.957 |
| 0.6825694444444445 | 49.956 |
| 0.6825810185185185 | 49.956 |
| 0.6825925925925925 | 49.956 |
| 0.6826041666666667 | 49.954 |
| 0.6826157407407408 | 49.952 |
| 0.6826273148148148 | 49.95 |
| 0.6826388888888889 | 49.946 |
| 0.682650462962963 | 49.944 |
| 0.6826620370370371 | 49.941 |
| 0.682673611111111 | 49.94 |
| 0.6826851851851852 | 49.94 |
| 0.6826967592592593 | 49.94 |
| 0.6827083333333334 | 49.939 |
| 0.6827199074074074 | 49.939 |
| 0.6827314814814814 | 49.938 |
| 0.6827430555555556 | 49.938 |
| 0.6827546296296297 | 49.939 |
| 0.6827662037037037 | 49.942 |
| 0.6827777777777778 | 49.942 |
| 0.6827893518518519 | 49.944 |
| 0.6828009259259259 | 49.946 |
| 0.6828124999999999 | 49.947 |
| 0.6828240740740741 | 49.948 |
| 0.6828356481481482 | 49.949 |
| 0.6828472222222222 | 49.949 |
| 0.6828587962962963 | 49.949 |
| 0.6828703703703703 | 49.95 |
| 0.6828819444444445 | 49.95 |
| 0.6828935185185184 | 49.95 |
| 0.6829050925925926 | 49.949 |
| 0.6829166666666667 | 49.949 |
| 0.6829282407407408 | 49.948 |
| 0.6829398148148148 | 49.948 |
| 0.6829513888888888 | 49.948 |
| 0.682962962962963 | 49.947 |
| 0.6829745370370371 | 49.946 |
| 0.6829861111111111 | 49.945 |
| 0.6829976851851852 | 49.945 |
| 0.6830092592592593 | 49.946 |
| 0.6830208333333333 | 49.947 |
| 0.6830324074074073 | 49.948 |
| 0.6830439814814815 | 49.946 |
| 0.6830555555555556 | 49.947 |
| 0.6830671296296296 | 49.944 |
| 0.6830787037037037 | 49.942 |
| 0.6830902777777778 | 49.941 |
| 0.6831018518518519 | 49.94 |
| 0.6831134259259258 | 49.939 |
| 0.683125 | 49.94 |
| 0.6831365740740741 | 49.94 |
| 0.6831481481481482 | 49.94 |
| 0.6831597222222222 | 49.94 |
| 0.6831712962962962 | 49.941 |
| 0.6831828703703704 | 49.942 |
| 0.6831944444444445 | 49.94 |
| 0.6832060185185185 | 49.94 |
| 0.6832175925925926 | 49.94 |
| 0.6832291666666667 | 49.94 |
| 0.6832407407407407 | 49.943 |
| 0.6832523148148147 | 49.943 |
| 0.6832638888888889 | 49.946 |
| 0.683275462962963 | 49.948 |
| 0.683287037037037 | 49.95 |
| 0.6832986111111111 | 49.952 |
| 0.6833101851851852 | 49.953 |
| 0.6833217592592593 | 49.955 |
| 0.6833333333333332 | 49.957 |
| 0.6833449074074074 | 49.959 |
| 0.6833564814814815 | 49.959 |
| 0.6833680555555556 | 49.959 |
| 0.6833796296296296 | 49.959 |
| 0.6833912037037037 | 49.958 |
| 0.6834027777777778 | 49.956 |
| 0.683414351851852 | 49.954 |
| 0.6834259259259259 | 49.952 |
| 0.6834375 | 49.95 |
| 0.6834490740740741 | 49.947 |
| 0.6834606481481482 | 49.944 |
| 0.6834722222222221 | 49.941 |
| 0.6834837962962963 | 49.94 |
| 0.6834953703703704 | 49.939 |
| 0.6835069444444444 | 49.938 |
| 0.6835185185185185 | 49.938 |
| 0.6835300925925926 | 49.937 |
| 0.6835416666666667 | 49.937 |
| 0.6835532407407406 | 49.937 |
| 0.6835648148148148 | 49.938 |
| 0.6835763888888889 | 49.938 |
| 0.683587962962963 | 49.937 |
| 0.683599537037037 | 49.937 |
| 0.6836111111111111 | 49.938 |
| 0.6836226851851852 | 49.938 |
| 0.6836342592592594 | 49.94 |
| 0.6836458333333333 | 49.944 |
| 0.6836574074074074 | 49.946 |
| 0.6836689814814815 | 49.948 |
| 0.6836805555555556 | 49.951 |
| 0.6836921296296296 | 49.954 |
| 0.6837037037037037 | 49.957 |
| 0.6837152777777779 | 49.961 |
| 0.6837268518518518 | 49.962 |
| 0.6837384259259259 | 49.964 |
| 0.68375 | 49.966 |
| 0.6837615740740741 | 49.967 |
| 0.683773148148148 | 49.969 |
| 0.6837847222222222 | 49.973 |
| 0.6837962962962963 | 49.974 |
| 0.6838078703703704 | 49.976 |
| 0.6838194444444444 | 49.98 |
| 0.6838310185185185 | 49.982 |
| 0.6838425925925926 | 49.986 |
| 0.6838541666666668 | 49.989 |
| 0.6838657407407407 | 49.991 |
| 0.6838773148148148 | 49.995 |
| 0.6838888888888889 | 49.996 |
| 0.683900462962963 | 49.998 |
| 0.683912037037037 | 49.999 |
| 0.6839236111111111 | 50 |
| 0.6839351851851853 | 50.001 |
| 0.6839467592592593 | 50.001 |
| 0.6839583333333333 | 49.999 |
| 0.6839699074074074 | 49.998 |
| 0.6839814814814815 | 49.997 |
| 0.6839930555555555 | 49.996 |
| 0.6840046296296296 | 49.995 |
| 0.6840162037037038 | 49.992 |
| 0.6840277777777778 | 49.991 |
| 0.6840393518518518 | 49.989 |
| 0.6840509259259259 | 49.986 |
| 0.6840625 | 49.984 |
| 0.6840740740740742 | 49.981 |
| 0.6840856481481481 | 49.979 |
| 0.6840972222222222 | 49.979 |
| 0.6841087962962963 | 49.978 |
| 0.6841203703703704 | 49.981 |
| 0.6841319444444444 | 49.981 |
| 0.6841435185185185 | 49.985 |
| 0.6841550925925927 | 49.987 |
| 0.6841666666666667 | 49.988 |
| 0.6841782407407407 | 49.99 |
| 0.6841898148148148 | 49.991 |
| 0.6842013888888889 | 49.991 |
| 0.6842129629629629 | 49.992 |
| 0.684224537037037 | 49.991 |
| 0.6842361111111112 | 49.992 |
| 0.6842476851851852 | 49.992 |
| 0.6842592592592592 | 49.993 |
| 0.6842708333333333 | 49.995 |
| 0.6842824074074074 | 49.996 |
| 0.6842939814814816 | 49.995 |
| 0.6843055555555555 | 49.996 |
| 0.6843171296296297 | 49.996 |
| 0.6843287037037037 | 49.997 |
| 0.6843402777777778 | 49.998 |
| 0.6843518518518518 | 49.998 |
| 0.6843634259259259 | 49.997 |
| 0.6843750000000001 | 49.999 |
| 0.6843865740740741 | 49.999 |
| 0.6843981481481481 | 50.001 |
| 0.6844097222222222 | 50.005 |
| 0.6844212962962963 | 50.007 |
| 0.6844328703703703 | 50.008 |
| 0.6844444444444444 | 50.011 |
| 0.6844560185185186 | 50.012 |
| 0.6844675925925926 | 50.013 |
| 0.6844791666666666 | 50.015 |
| 0.6844907407407407 | 50.015 |
| 0.6845023148148148 | 50.014 |
| 0.684513888888889 | 50.016 |
| 0.6845254629629629 | 50.015 |
| 0.684537037037037 | 50.014 |
| 0.6845486111111111 | 50.016 |
| 0.6845601851851852 | 50.016 |
| 0.6845717592592592 | 50.018 |
| 0.6845833333333333 | 50.02 |
| 0.6845949074074075 | 50.022 |
| 0.6846064814814815 | 50.025 |
| 0.6846180555555555 | 50.028 |
| 0.6846296296296296 | 50.032 |
| 0.6846412037037037 | 50.036 |
| 0.6846527777777777 | 50.038 |
| 0.6846643518518518 | 50.037 |
| 0.684675925925926 | 50.037 |
| 0.6846875 | 50.034 |
| 0.684699074074074 | 50.033 |
| 0.6847106481481481 | 50.032 |